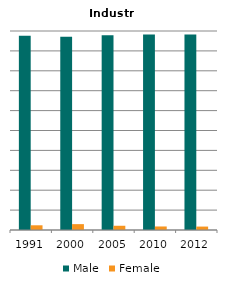
| Category | Male | Female |
|---|---|---|
| 1991.0 | 0.976 | 0.024 |
| 2000.0 | 0.971 | 0.029 |
| 2005.0 | 0.979 | 0.021 |
| 2010.0 | 0.982 | 0.018 |
| 2012.0 | 0.983 | 0.017 |